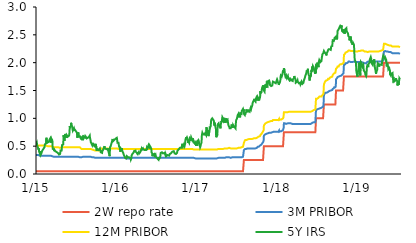
| Category | 2W repo rate | 3M PRIBOR | 12M PRIBOR | 5Y IRS |
|---|---|---|---|---|
| 2015-01-02 | 0.05 | 0.34 | 0.51 | 0.55 |
| 2015-01-05 | 0.05 | 0.34 | 0.51 | 0.57 |
| 2015-01-06 | 0.05 | 0.34 | 0.51 | 0.54 |
| 2015-01-07 | 0.05 | 0.34 | 0.51 | 0.51 |
| 2015-01-08 | 0.05 | 0.34 | 0.51 | 0.52 |
| 2015-01-09 | 0.05 | 0.34 | 0.51 | 0.49 |
| 2015-01-12 | 0.05 | 0.34 | 0.51 | 0.48 |
| 2015-01-13 | 0.05 | 0.33 | 0.51 | 0.44 |
| 2015-01-14 | 0.05 | 0.33 | 0.51 | 0.46 |
| 2015-01-15 | 0.05 | 0.33 | 0.51 | 0.45 |
| 2015-01-16 | 0.05 | 0.33 | 0.51 | 0.4 |
| 2015-01-19 | 0.05 | 0.33 | 0.51 | 0.4 |
| 2015-01-20 | 0.05 | 0.33 | 0.51 | 0.36 |
| 2015-01-21 | 0.05 | 0.33 | 0.51 | 0.38 |
| 2015-01-22 | 0.05 | 0.33 | 0.51 | 0.41 |
| 2015-01-23 | 0.05 | 0.33 | 0.51 | 0.35 |
| 2015-01-26 | 0.05 | 0.33 | 0.51 | 0.36 |
| 2015-01-27 | 0.05 | 0.33 | 0.51 | 0.38 |
| 2015-01-28 | 0.05 | 0.33 | 0.51 | 0.4 |
| 2015-01-29 | 0.05 | 0.33 | 0.51 | 0.41 |
| 2015-01-30 | 0.05 | 0.33 | 0.51 | 0.42 |
| 2015-02-02 | 0.05 | 0.33 | 0.51 | 0.41 |
| 2015-02-03 | 0.05 | 0.33 | 0.51 | 0.41 |
| 2015-02-04 | 0.05 | 0.33 | 0.51 | 0.45 |
| 2015-02-05 | 0.05 | 0.33 | 0.51 | 0.46 |
| 2015-02-06 | 0.05 | 0.33 | 0.51 | 0.46 |
| 2015-02-09 | 0.05 | 0.33 | 0.51 | 0.48 |
| 2015-02-10 | 0.05 | 0.33 | 0.51 | 0.49 |
| 2015-02-11 | 0.05 | 0.33 | 0.51 | 0.53 |
| 2015-02-12 | 0.05 | 0.33 | 0.51 | 0.54 |
| 2015-02-13 | 0.05 | 0.33 | 0.51 | 0.53 |
| 2015-02-16 | 0.05 | 0.33 | 0.51 | 0.55 |
| 2015-02-17 | 0.05 | 0.33 | 0.51 | 0.58 |
| 2015-02-18 | 0.05 | 0.33 | 0.51 | 0.65 |
| 2015-02-19 | 0.05 | 0.33 | 0.51 | 0.55 |
| 2015-02-20 | 0.05 | 0.33 | 0.5 | 0.6 |
| 2015-02-23 | 0.05 | 0.33 | 0.5 | 0.61 |
| 2015-02-24 | 0.05 | 0.33 | 0.5 | 0.61 |
| 2015-02-25 | 0.05 | 0.33 | 0.5 | 0.57 |
| 2015-02-26 | 0.05 | 0.33 | 0.5 | 0.57 |
| 2015-02-27 | 0.05 | 0.33 | 0.5 | 0.57 |
| 2015-03-02 | 0.05 | 0.33 | 0.5 | 0.58 |
| 2015-03-03 | 0.05 | 0.33 | 0.5 | 0.57 |
| 2015-03-04 | 0.05 | 0.33 | 0.5 | 0.62 |
| 2015-03-05 | 0.05 | 0.33 | 0.5 | 0.62 |
| 2015-03-06 | 0.05 | 0.33 | 0.5 | 0.62 |
| 2015-03-09 | 0.05 | 0.33 | 0.5 | 0.65 |
| 2015-03-10 | 0.05 | 0.33 | 0.5 | 0.62 |
| 2015-03-11 | 0.05 | 0.33 | 0.5 | 0.62 |
| 2015-03-12 | 0.05 | 0.33 | 0.5 | 0.56 |
| 2015-03-13 | 0.05 | 0.33 | 0.5 | 0.63 |
| 2015-03-16 | 0.05 | 0.32 | 0.49 | 0.61 |
| 2015-03-17 | 0.05 | 0.32 | 0.49 | 0.59 |
| 2015-03-18 | 0.05 | 0.31 | 0.49 | 0.5 |
| 2015-03-19 | 0.05 | 0.31 | 0.48 | 0.45 |
| 2015-03-20 | 0.05 | 0.31 | 0.48 | 0.44 |
| 2015-03-23 | 0.05 | 0.31 | 0.48 | 0.46 |
| 2015-03-24 | 0.05 | 0.31 | 0.48 | 0.44 |
| 2015-03-25 | 0.05 | 0.31 | 0.48 | 0.43 |
| 2015-03-26 | 0.05 | 0.31 | 0.48 | 0.41 |
| 2015-03-27 | 0.05 | 0.31 | 0.48 | 0.43 |
| 2015-03-30 | 0.05 | 0.31 | 0.48 | 0.41 |
| 2015-03-31 | 0.05 | 0.31 | 0.48 | 0.41 |
| 2015-04-01 | 0.05 | 0.31 | 0.48 | 0.41 |
| 2015-04-02 | 0.05 | 0.31 | 0.48 | 0.4 |
| 2015-04-03 | 0.05 | 0.31 | 0.48 | 0.4 |
| 2015-04-07 | 0.05 | 0.31 | 0.48 | 0.39 |
| 2015-04-08 | 0.05 | 0.31 | 0.48 | 0.39 |
| 2015-04-09 | 0.05 | 0.31 | 0.48 | 0.38 |
| 2015-04-10 | 0.05 | 0.31 | 0.48 | 0.38 |
| 2015-04-13 | 0.05 | 0.31 | 0.48 | 0.37 |
| 2015-04-14 | 0.05 | 0.31 | 0.47 | 0.37 |
| 2015-04-15 | 0.05 | 0.31 | 0.48 | 0.37 |
| 2015-04-16 | 0.05 | 0.31 | 0.47 | 0.35 |
| 2015-04-17 | 0.05 | 0.31 | 0.47 | 0.36 |
| 2015-04-20 | 0.05 | 0.31 | 0.47 | 0.35 |
| 2015-04-21 | 0.05 | 0.31 | 0.47 | 0.36 |
| 2015-04-22 | 0.05 | 0.31 | 0.47 | 0.38 |
| 2015-04-23 | 0.05 | 0.31 | 0.48 | 0.42 |
| 2015-04-24 | 0.05 | 0.31 | 0.47 | 0.42 |
| 2015-04-27 | 0.05 | 0.31 | 0.48 | 0.41 |
| 2015-04-28 | 0.05 | 0.31 | 0.48 | 0.42 |
| 2015-04-29 | 0.05 | 0.31 | 0.48 | 0.47 |
| 2015-04-30 | 0.05 | 0.31 | 0.48 | 0.52 |
| 2015-05-04 | 0.05 | 0.31 | 0.48 | 0.53 |
| 2015-05-05 | 0.05 | 0.31 | 0.48 | 0.53 |
| 2015-05-06 | 0.05 | 0.31 | 0.48 | 0.59 |
| 2015-05-07 | 0.05 | 0.31 | 0.48 | 0.7 |
| 2015-05-11 | 0.05 | 0.31 | 0.48 | 0.6 |
| 2015-05-12 | 0.05 | 0.31 | 0.48 | 0.69 |
| 2015-05-13 | 0.05 | 0.31 | 0.48 | 0.66 |
| 2015-05-14 | 0.05 | 0.31 | 0.48 | 0.72 |
| 2015-05-15 | 0.05 | 0.31 | 0.48 | 0.7 |
| 2015-05-18 | 0.05 | 0.31 | 0.48 | 0.7 |
| 2015-05-19 | 0.05 | 0.31 | 0.48 | 0.65 |
| 2015-05-20 | 0.05 | 0.31 | 0.48 | 0.68 |
| 2015-05-21 | 0.05 | 0.31 | 0.48 | 0.7 |
| 2015-05-22 | 0.05 | 0.31 | 0.48 | 0.7 |
| 2015-05-25 | 0.05 | 0.31 | 0.48 | 0.7 |
| 2015-05-26 | 0.05 | 0.31 | 0.48 | 0.67 |
| 2015-05-27 | 0.05 | 0.31 | 0.48 | 0.67 |
| 2015-05-28 | 0.05 | 0.31 | 0.48 | 0.66 |
| 2015-05-29 | 0.05 | 0.31 | 0.48 | 0.68 |
| 2015-06-01 | 0.05 | 0.31 | 0.48 | 0.69 |
| 2015-06-02 | 0.05 | 0.31 | 0.48 | 0.72 |
| 2015-06-03 | 0.05 | 0.31 | 0.48 | 0.75 |
| 2015-06-04 | 0.05 | 0.31 | 0.48 | 0.86 |
| 2015-06-05 | 0.05 | 0.31 | 0.48 | 0.84 |
| 2015-06-08 | 0.05 | 0.31 | 0.48 | 0.84 |
| 2015-06-09 | 0.05 | 0.31 | 0.48 | 0.86 |
| 2015-06-10 | 0.05 | 0.31 | 0.48 | 0.92 |
| 2015-06-11 | 0.05 | 0.31 | 0.48 | 0.92 |
| 2015-06-12 | 0.05 | 0.31 | 0.48 | 0.89 |
| 2015-06-15 | 0.05 | 0.31 | 0.48 | 0.85 |
| 2015-06-16 | 0.05 | 0.31 | 0.48 | 0.82 |
| 2015-06-17 | 0.05 | 0.31 | 0.48 | 0.82 |
| 2015-06-18 | 0.05 | 0.31 | 0.48 | 0.78 |
| 2015-06-19 | 0.05 | 0.31 | 0.48 | 0.77 |
| 2015-06-22 | 0.05 | 0.31 | 0.48 | 0.79 |
| 2015-06-23 | 0.05 | 0.31 | 0.48 | 0.82 |
| 2015-06-24 | 0.05 | 0.31 | 0.48 | 0.8 |
| 2015-06-25 | 0.05 | 0.31 | 0.48 | 0.78 |
| 2015-06-26 | 0.05 | 0.31 | 0.48 | 0.8 |
| 2015-06-29 | 0.05 | 0.31 | 0.48 | 0.8 |
| 2015-06-30 | 0.05 | 0.31 | 0.48 | 0.78 |
| 2015-07-01 | 0.05 | 0.31 | 0.48 | 0.79 |
| 2015-07-02 | 0.05 | 0.31 | 0.48 | 0.79 |
| 2015-07-03 | 0.05 | 0.31 | 0.48 | 0.78 |
| 2015-07-07 | 0.05 | 0.31 | 0.48 | 0.74 |
| 2015-07-08 | 0.05 | 0.31 | 0.47 | 0.68 |
| 2015-07-09 | 0.05 | 0.31 | 0.47 | 0.65 |
| 2015-07-10 | 0.05 | 0.31 | 0.47 | 0.7 |
| 2015-07-13 | 0.05 | 0.31 | 0.48 | 0.75 |
| 2015-07-14 | 0.05 | 0.31 | 0.48 | 0.68 |
| 2015-07-15 | 0.05 | 0.3 | 0.48 | 0.69 |
| 2015-07-16 | 0.05 | 0.3 | 0.48 | 0.67 |
| 2015-07-17 | 0.05 | 0.3 | 0.48 | 0.69 |
| 2015-07-20 | 0.05 | 0.3 | 0.48 | 0.68 |
| 2015-07-21 | 0.05 | 0.3 | 0.48 | 0.66 |
| 2015-07-22 | 0.05 | 0.31 | 0.48 | 0.67 |
| 2015-07-23 | 0.05 | 0.31 | 0.48 | 0.67 |
| 2015-07-24 | 0.05 | 0.3 | 0.48 | 0.64 |
| 2015-07-27 | 0.05 | 0.3 | 0.45 | 0.63 |
| 2015-07-28 | 0.05 | 0.3 | 0.45 | 0.63 |
| 2015-07-29 | 0.05 | 0.3 | 0.45 | 0.66 |
| 2015-07-30 | 0.05 | 0.3 | 0.45 | 0.62 |
| 2015-07-31 | 0.05 | 0.31 | 0.45 | 0.62 |
| 2015-08-03 | 0.05 | 0.31 | 0.45 | 0.62 |
| 2015-08-04 | 0.05 | 0.31 | 0.45 | 0.62 |
| 2015-08-05 | 0.05 | 0.31 | 0.45 | 0.64 |
| 2015-08-06 | 0.05 | 0.31 | 0.45 | 0.68 |
| 2015-08-07 | 0.05 | 0.31 | 0.45 | 0.68 |
| 2015-08-10 | 0.05 | 0.31 | 0.45 | 0.68 |
| 2015-08-11 | 0.05 | 0.31 | 0.45 | 0.67 |
| 2015-08-12 | 0.05 | 0.31 | 0.45 | 0.64 |
| 2015-08-13 | 0.05 | 0.31 | 0.45 | 0.65 |
| 2015-08-14 | 0.05 | 0.31 | 0.45 | 0.68 |
| 2015-08-17 | 0.05 | 0.31 | 0.45 | 0.67 |
| 2015-08-18 | 0.05 | 0.31 | 0.45 | 0.66 |
| 2015-08-19 | 0.05 | 0.31 | 0.45 | 0.65 |
| 2015-08-20 | 0.05 | 0.31 | 0.45 | 0.64 |
| 2015-08-21 | 0.05 | 0.31 | 0.45 | 0.64 |
| 2015-08-24 | 0.05 | 0.31 | 0.45 | 0.63 |
| 2015-08-25 | 0.05 | 0.31 | 0.45 | 0.65 |
| 2015-08-26 | 0.05 | 0.31 | 0.45 | 0.65 |
| 2015-08-27 | 0.05 | 0.31 | 0.45 | 0.66 |
| 2015-08-28 | 0.05 | 0.31 | 0.45 | 0.66 |
| 2015-08-31 | 0.05 | 0.31 | 0.45 | 0.67 |
| 2015-09-01 | 0.05 | 0.31 | 0.45 | 0.68 |
| 2015-09-02 | 0.05 | 0.31 | 0.45 | 0.68 |
| 2015-09-03 | 0.05 | 0.31 | 0.45 | 0.69 |
| 2015-09-04 | 0.05 | 0.31 | 0.45 | 0.65 |
| 2015-09-07 | 0.05 | 0.31 | 0.45 | 0.6 |
| 2015-09-08 | 0.05 | 0.3 | 0.44 | 0.57 |
| 2015-09-09 | 0.05 | 0.3 | 0.44 | 0.57 |
| 2015-09-10 | 0.05 | 0.3 | 0.44 | 0.57 |
| 2015-09-11 | 0.05 | 0.3 | 0.44 | 0.56 |
| 2015-09-14 | 0.05 | 0.3 | 0.44 | 0.52 |
| 2015-09-15 | 0.05 | 0.3 | 0.44 | 0.54 |
| 2015-09-16 | 0.05 | 0.31 | 0.44 | 0.56 |
| 2015-09-17 | 0.05 | 0.31 | 0.44 | 0.57 |
| 2015-09-18 | 0.05 | 0.31 | 0.44 | 0.53 |
| 2015-09-21 | 0.05 | 0.3 | 0.43 | 0.53 |
| 2015-09-22 | 0.05 | 0.3 | 0.43 | 0.51 |
| 2015-09-23 | 0.05 | 0.3 | 0.43 | 0.53 |
| 2015-09-24 | 0.05 | 0.3 | 0.43 | 0.53 |
| 2015-09-25 | 0.05 | 0.29 | 0.42 | 0.53 |
| 2015-09-29 | 0.05 | 0.29 | 0.42 | 0.53 |
| 2015-09-30 | 0.05 | 0.29 | 0.42 | 0.48 |
| 2015-10-01 | 0.05 | 0.29 | 0.42 | 0.53 |
| 2015-10-02 | 0.05 | 0.29 | 0.42 | 0.53 |
| 2015-10-05 | 0.05 | 0.29 | 0.42 | 0.42 |
| 2015-10-06 | 0.05 | 0.29 | 0.42 | 0.46 |
| 2015-10-07 | 0.05 | 0.29 | 0.42 | 0.46 |
| 2015-10-08 | 0.05 | 0.29 | 0.42 | 0.44 |
| 2015-10-09 | 0.05 | 0.29 | 0.42 | 0.44 |
| 2015-10-12 | 0.05 | 0.29 | 0.42 | 0.45 |
| 2015-10-13 | 0.05 | 0.29 | 0.42 | 0.43 |
| 2015-10-14 | 0.05 | 0.29 | 0.42 | 0.43 |
| 2015-10-15 | 0.05 | 0.29 | 0.42 | 0.43 |
| 2015-10-16 | 0.05 | 0.29 | 0.42 | 0.44 |
| 2015-10-19 | 0.05 | 0.29 | 0.42 | 0.46 |
| 2015-10-20 | 0.05 | 0.29 | 0.42 | 0.44 |
| 2015-10-21 | 0.05 | 0.29 | 0.42 | 0.45 |
| 2015-10-22 | 0.05 | 0.29 | 0.42 | 0.42 |
| 2015-10-23 | 0.05 | 0.29 | 0.42 | 0.39 |
| 2015-10-26 | 0.05 | 0.29 | 0.46 | 0.4 |
| 2015-10-27 | 0.05 | 0.29 | 0.45 | 0.38 |
| 2015-10-29 | 0.05 | 0.29 | 0.45 | 0.38 |
| 2015-10-30 | 0.05 | 0.29 | 0.45 | 0.41 |
| 2015-11-02 | 0.05 | 0.29 | 0.45 | 0.43 |
| 2015-11-03 | 0.05 | 0.29 | 0.46 | 0.44 |
| 2015-11-04 | 0.05 | 0.29 | 0.46 | 0.44 |
| 2015-11-05 | 0.05 | 0.29 | 0.46 | 0.44 |
| 2015-11-06 | 0.05 | 0.29 | 0.45 | 0.44 |
| 2015-11-09 | 0.05 | 0.29 | 0.46 | 0.5 |
| 2015-11-10 | 0.05 | 0.29 | 0.46 | 0.46 |
| 2015-11-11 | 0.05 | 0.29 | 0.46 | 0.46 |
| 2015-11-12 | 0.05 | 0.29 | 0.46 | 0.45 |
| 2015-11-13 | 0.05 | 0.29 | 0.46 | 0.46 |
| 2015-11-16 | 0.05 | 0.29 | 0.46 | 0.45 |
| 2015-11-18 | 0.05 | 0.29 | 0.46 | 0.45 |
| 2015-11-19 | 0.05 | 0.29 | 0.46 | 0.44 |
| 2015-11-20 | 0.05 | 0.29 | 0.46 | 0.44 |
| 2015-11-23 | 0.05 | 0.29 | 0.46 | 0.44 |
| 2015-11-24 | 0.05 | 0.29 | 0.46 | 0.44 |
| 2015-11-25 | 0.05 | 0.29 | 0.46 | 0.46 |
| 2015-11-26 | 0.05 | 0.29 | 0.46 | 0.42 |
| 2015-11-27 | 0.05 | 0.29 | 0.45 | 0.42 |
| 2015-11-30 | 0.05 | 0.29 | 0.45 | 0.36 |
| 2015-12-01 | 0.05 | 0.28 | 0.45 | 0.37 |
| 2015-12-02 | 0.05 | 0.28 | 0.45 | 0.32 |
| 2015-12-03 | 0.05 | 0.28 | 0.45 | 0.34 |
| 2015-12-04 | 0.05 | 0.29 | 0.46 | 0.48 |
| 2015-12-07 | 0.05 | 0.29 | 0.46 | 0.5 |
| 2015-12-08 | 0.05 | 0.29 | 0.46 | 0.49 |
| 2015-12-09 | 0.05 | 0.29 | 0.46 | 0.51 |
| 2015-12-10 | 0.05 | 0.29 | 0.46 | 0.54 |
| 2015-12-11 | 0.05 | 0.29 | 0.46 | 0.53 |
| 2015-12-14 | 0.05 | 0.29 | 0.46 | 0.55 |
| 2015-12-15 | 0.05 | 0.29 | 0.46 | 0.61 |
| 2015-12-16 | 0.05 | 0.29 | 0.46 | 0.63 |
| 2015-12-17 | 0.05 | 0.29 | 0.46 | 0.62 |
| 2015-12-18 | 0.05 | 0.29 | 0.46 | 0.59 |
| 2015-12-21 | 0.05 | 0.29 | 0.46 | 0.59 |
| 2015-12-22 | 0.05 | 0.29 | 0.46 | 0.59 |
| 2015-12-23 | 0.05 | 0.29 | 0.46 | 0.61 |
| 2015-12-28 | 0.05 | 0.29 | 0.46 | 0.63 |
| 2015-12-29 | 0.05 | 0.29 | 0.46 | 0.63 |
| 2015-12-30 | 0.05 | 0.29 | 0.46 | 0.64 |
| 2015-12-31 | 0.05 | 0.29 | 0.46 | 0.64 |
| 2016-01-04 | 0.05 | 0.29 | 0.46 | 0.65 |
| 2016-01-05 | 0.05 | 0.29 | 0.46 | 0.63 |
| 2016-01-06 | 0.05 | 0.29 | 0.46 | 0.62 |
| 2016-01-07 | 0.05 | 0.29 | 0.46 | 0.56 |
| 2016-01-08 | 0.05 | 0.29 | 0.46 | 0.57 |
| 2016-01-11 | 0.05 | 0.29 | 0.45 | 0.56 |
| 2016-01-12 | 0.05 | 0.29 | 0.45 | 0.56 |
| 2016-01-13 | 0.05 | 0.29 | 0.45 | 0.56 |
| 2016-01-14 | 0.05 | 0.29 | 0.45 | 0.5 |
| 2016-01-15 | 0.05 | 0.29 | 0.45 | 0.49 |
| 2016-01-18 | 0.05 | 0.29 | 0.45 | 0.46 |
| 2016-01-19 | 0.05 | 0.29 | 0.45 | 0.46 |
| 2016-01-20 | 0.05 | 0.29 | 0.45 | 0.4 |
| 2016-01-21 | 0.05 | 0.29 | 0.45 | 0.43 |
| 2016-01-22 | 0.05 | 0.29 | 0.45 | 0.46 |
| 2016-01-25 | 0.05 | 0.29 | 0.45 | 0.45 |
| 2016-01-26 | 0.05 | 0.29 | 0.45 | 0.44 |
| 2016-01-27 | 0.05 | 0.29 | 0.45 | 0.46 |
| 2016-01-28 | 0.05 | 0.29 | 0.45 | 0.44 |
| 2016-01-29 | 0.05 | 0.29 | 0.45 | 0.41 |
| 2016-02-01 | 0.05 | 0.29 | 0.45 | 0.4 |
| 2016-02-02 | 0.05 | 0.29 | 0.45 | 0.38 |
| 2016-02-03 | 0.05 | 0.29 | 0.45 | 0.37 |
| 2016-02-04 | 0.05 | 0.29 | 0.45 | 0.37 |
| 2016-02-05 | 0.05 | 0.29 | 0.45 | 0.34 |
| 2016-02-08 | 0.05 | 0.29 | 0.45 | 0.32 |
| 2016-02-09 | 0.05 | 0.28 | 0.45 | 0.31 |
| 2016-02-10 | 0.05 | 0.28 | 0.45 | 0.31 |
| 2016-02-11 | 0.05 | 0.28 | 0.45 | 0.29 |
| 2016-02-12 | 0.05 | 0.28 | 0.45 | 0.28 |
| 2016-02-15 | 0.05 | 0.28 | 0.45 | 0.28 |
| 2016-02-16 | 0.05 | 0.28 | 0.45 | 0.28 |
| 2016-02-17 | 0.05 | 0.28 | 0.45 | 0.28 |
| 2016-02-18 | 0.05 | 0.28 | 0.45 | 0.3 |
| 2016-02-19 | 0.05 | 0.28 | 0.45 | 0.32 |
| 2016-02-22 | 0.05 | 0.28 | 0.45 | 0.32 |
| 2016-02-23 | 0.05 | 0.28 | 0.45 | 0.32 |
| 2016-02-24 | 0.05 | 0.28 | 0.45 | 0.3 |
| 2016-02-25 | 0.05 | 0.28 | 0.45 | 0.3 |
| 2016-02-26 | 0.05 | 0.28 | 0.45 | 0.31 |
| 2016-02-29 | 0.05 | 0.28 | 0.45 | 0.3 |
| 2016-03-01 | 0.05 | 0.28 | 0.45 | 0.29 |
| 2016-03-02 | 0.05 | 0.28 | 0.45 | 0.31 |
| 2016-03-03 | 0.05 | 0.28 | 0.45 | 0.3 |
| 2016-03-04 | 0.05 | 0.28 | 0.45 | 0.29 |
| 2016-03-07 | 0.05 | 0.28 | 0.45 | 0.28 |
| 2016-03-08 | 0.05 | 0.28 | 0.45 | 0.26 |
| 2016-03-09 | 0.05 | 0.28 | 0.45 | 0.26 |
| 2016-03-10 | 0.05 | 0.28 | 0.45 | 0.28 |
| 2016-03-11 | 0.05 | 0.29 | 0.45 | 0.33 |
| 2016-03-14 | 0.05 | 0.29 | 0.45 | 0.34 |
| 2016-03-15 | 0.05 | 0.29 | 0.45 | 0.36 |
| 2016-03-16 | 0.05 | 0.29 | 0.45 | 0.37 |
| 2016-03-17 | 0.05 | 0.29 | 0.45 | 0.37 |
| 2016-03-18 | 0.05 | 0.29 | 0.45 | 0.37 |
| 2016-03-21 | 0.05 | 0.29 | 0.45 | 0.39 |
| 2016-03-22 | 0.05 | 0.29 | 0.45 | 0.41 |
| 2016-03-23 | 0.05 | 0.29 | 0.45 | 0.41 |
| 2016-03-24 | 0.05 | 0.29 | 0.45 | 0.4 |
| 2016-03-29 | 0.05 | 0.29 | 0.45 | 0.42 |
| 2016-03-30 | 0.05 | 0.29 | 0.45 | 0.4 |
| 2016-03-31 | 0.05 | 0.29 | 0.45 | 0.4 |
| 2016-04-01 | 0.05 | 0.29 | 0.45 | 0.4 |
| 2016-04-04 | 0.05 | 0.29 | 0.45 | 0.38 |
| 2016-04-05 | 0.05 | 0.29 | 0.45 | 0.37 |
| 2016-04-06 | 0.05 | 0.29 | 0.45 | 0.38 |
| 2016-04-07 | 0.05 | 0.29 | 0.45 | 0.36 |
| 2016-04-08 | 0.05 | 0.29 | 0.45 | 0.36 |
| 2016-04-11 | 0.05 | 0.29 | 0.45 | 0.35 |
| 2016-04-12 | 0.05 | 0.29 | 0.45 | 0.39 |
| 2016-04-13 | 0.05 | 0.29 | 0.45 | 0.37 |
| 2016-04-14 | 0.05 | 0.29 | 0.45 | 0.39 |
| 2016-04-15 | 0.05 | 0.29 | 0.45 | 0.37 |
| 2016-04-18 | 0.05 | 0.29 | 0.45 | 0.37 |
| 2016-04-19 | 0.05 | 0.29 | 0.45 | 0.39 |
| 2016-04-20 | 0.05 | 0.29 | 0.45 | 0.38 |
| 2016-04-21 | 0.05 | 0.29 | 0.45 | 0.41 |
| 2016-04-22 | 0.05 | 0.29 | 0.45 | 0.41 |
| 2016-04-25 | 0.05 | 0.29 | 0.45 | 0.42 |
| 2016-04-26 | 0.05 | 0.29 | 0.45 | 0.46 |
| 2016-04-27 | 0.05 | 0.29 | 0.45 | 0.46 |
| 2016-04-28 | 0.05 | 0.29 | 0.45 | 0.44 |
| 2016-04-29 | 0.05 | 0.29 | 0.45 | 0.45 |
| 2016-05-02 | 0.05 | 0.29 | 0.45 | 0.46 |
| 2016-05-03 | 0.05 | 0.29 | 0.45 | 0.46 |
| 2016-05-04 | 0.05 | 0.29 | 0.45 | 0.44 |
| 2016-05-05 | 0.05 | 0.29 | 0.45 | 0.45 |
| 2016-05-06 | 0.05 | 0.29 | 0.45 | 0.44 |
| 2016-05-09 | 0.05 | 0.29 | 0.45 | 0.43 |
| 2016-05-10 | 0.05 | 0.29 | 0.45 | 0.44 |
| 2016-05-11 | 0.05 | 0.29 | 0.45 | 0.43 |
| 2016-05-12 | 0.05 | 0.29 | 0.45 | 0.42 |
| 2016-05-13 | 0.05 | 0.29 | 0.45 | 0.43 |
| 2016-05-16 | 0.05 | 0.29 | 0.45 | 0.43 |
| 2016-05-17 | 0.05 | 0.29 | 0.45 | 0.44 |
| 2016-05-18 | 0.05 | 0.29 | 0.45 | 0.44 |
| 2016-05-19 | 0.05 | 0.29 | 0.45 | 0.46 |
| 2016-05-20 | 0.05 | 0.29 | 0.45 | 0.48 |
| 2016-05-23 | 0.05 | 0.29 | 0.45 | 0.46 |
| 2016-05-24 | 0.05 | 0.29 | 0.45 | 0.46 |
| 2016-05-25 | 0.05 | 0.29 | 0.45 | 0.48 |
| 2016-05-26 | 0.05 | 0.29 | 0.45 | 0.48 |
| 2016-05-27 | 0.05 | 0.29 | 0.45 | 0.51 |
| 2016-05-30 | 0.05 | 0.29 | 0.45 | 0.49 |
| 2016-05-31 | 0.05 | 0.29 | 0.45 | 0.52 |
| 2016-06-01 | 0.05 | 0.29 | 0.45 | 0.51 |
| 2016-06-02 | 0.05 | 0.29 | 0.45 | 0.51 |
| 2016-06-03 | 0.05 | 0.29 | 0.45 | 0.51 |
| 2016-06-06 | 0.05 | 0.29 | 0.45 | 0.48 |
| 2016-06-07 | 0.05 | 0.29 | 0.45 | 0.49 |
| 2016-06-08 | 0.05 | 0.29 | 0.45 | 0.47 |
| 2016-06-09 | 0.05 | 0.29 | 0.45 | 0.45 |
| 2016-06-10 | 0.05 | 0.29 | 0.45 | 0.39 |
| 2016-06-13 | 0.05 | 0.29 | 0.45 | 0.37 |
| 2016-06-14 | 0.05 | 0.29 | 0.45 | 0.32 |
| 2016-06-15 | 0.05 | 0.29 | 0.45 | 0.32 |
| 2016-06-16 | 0.05 | 0.29 | 0.45 | 0.32 |
| 2016-06-17 | 0.05 | 0.29 | 0.45 | 0.35 |
| 2016-06-20 | 0.05 | 0.29 | 0.45 | 0.35 |
| 2016-06-21 | 0.05 | 0.29 | 0.45 | 0.36 |
| 2016-06-22 | 0.05 | 0.29 | 0.45 | 0.36 |
| 2016-06-23 | 0.05 | 0.29 | 0.45 | 0.36 |
| 2016-06-24 | 0.05 | 0.29 | 0.45 | 0.33 |
| 2016-06-27 | 0.05 | 0.29 | 0.45 | 0.32 |
| 2016-06-28 | 0.05 | 0.29 | 0.45 | 0.35 |
| 2016-06-29 | 0.05 | 0.29 | 0.45 | 0.33 |
| 2016-06-30 | 0.05 | 0.29 | 0.45 | 0.31 |
| 2016-07-01 | 0.05 | 0.29 | 0.45 | 0.31 |
| 2016-07-04 | 0.05 | 0.29 | 0.45 | 0.29 |
| 2016-07-07 | 0.05 | 0.29 | 0.45 | 0.28 |
| 2016-07-08 | 0.05 | 0.29 | 0.45 | 0.28 |
| 2016-07-11 | 0.05 | 0.29 | 0.45 | 0.26 |
| 2016-07-12 | 0.05 | 0.29 | 0.45 | 0.3 |
| 2016-07-13 | 0.05 | 0.29 | 0.45 | 0.29 |
| 2016-07-14 | 0.05 | 0.29 | 0.45 | 0.27 |
| 2016-07-15 | 0.05 | 0.29 | 0.45 | 0.28 |
| 2016-07-18 | 0.05 | 0.29 | 0.45 | 0.29 |
| 2016-07-19 | 0.05 | 0.29 | 0.45 | 0.28 |
| 2016-07-20 | 0.05 | 0.29 | 0.45 | 0.32 |
| 2016-07-21 | 0.05 | 0.29 | 0.45 | 0.36 |
| 2016-07-22 | 0.05 | 0.29 | 0.45 | 0.38 |
| 2016-07-25 | 0.05 | 0.29 | 0.45 | 0.38 |
| 2016-07-26 | 0.05 | 0.29 | 0.45 | 0.38 |
| 2016-07-27 | 0.05 | 0.29 | 0.45 | 0.39 |
| 2016-07-28 | 0.05 | 0.29 | 0.45 | 0.38 |
| 2016-07-29 | 0.05 | 0.29 | 0.45 | 0.38 |
| 2016-08-01 | 0.05 | 0.29 | 0.45 | 0.37 |
| 2016-08-02 | 0.05 | 0.29 | 0.45 | 0.37 |
| 2016-08-03 | 0.05 | 0.29 | 0.45 | 0.37 |
| 2016-08-04 | 0.05 | 0.29 | 0.45 | 0.38 |
| 2016-08-05 | 0.05 | 0.29 | 0.45 | 0.38 |
| 2016-08-08 | 0.05 | 0.29 | 0.45 | 0.38 |
| 2016-08-09 | 0.05 | 0.29 | 0.45 | 0.37 |
| 2016-08-10 | 0.05 | 0.29 | 0.45 | 0.37 |
| 2016-08-11 | 0.05 | 0.29 | 0.45 | 0.35 |
| 2016-08-12 | 0.05 | 0.29 | 0.45 | 0.37 |
| 2016-08-15 | 0.05 | 0.29 | 0.45 | 0.34 |
| 2016-08-16 | 0.05 | 0.29 | 0.45 | 0.32 |
| 2016-08-17 | 0.05 | 0.29 | 0.45 | 0.33 |
| 2016-08-18 | 0.05 | 0.29 | 0.45 | 0.33 |
| 2016-08-19 | 0.05 | 0.29 | 0.45 | 0.33 |
| 2016-08-22 | 0.05 | 0.29 | 0.45 | 0.34 |
| 2016-08-23 | 0.05 | 0.29 | 0.45 | 0.33 |
| 2016-08-24 | 0.05 | 0.29 | 0.45 | 0.33 |
| 2016-08-25 | 0.05 | 0.29 | 0.45 | 0.33 |
| 2016-08-26 | 0.05 | 0.29 | 0.45 | 0.33 |
| 2016-08-29 | 0.05 | 0.29 | 0.45 | 0.33 |
| 2016-08-30 | 0.05 | 0.29 | 0.45 | 0.33 |
| 2016-08-31 | 0.05 | 0.29 | 0.45 | 0.34 |
| 2016-09-01 | 0.05 | 0.29 | 0.45 | 0.36 |
| 2016-09-02 | 0.05 | 0.29 | 0.45 | 0.36 |
| 2016-09-05 | 0.05 | 0.29 | 0.45 | 0.37 |
| 2016-09-06 | 0.05 | 0.29 | 0.45 | 0.37 |
| 2016-09-07 | 0.05 | 0.29 | 0.45 | 0.36 |
| 2016-09-08 | 0.05 | 0.29 | 0.45 | 0.36 |
| 2016-09-09 | 0.05 | 0.29 | 0.45 | 0.38 |
| 2016-09-12 | 0.05 | 0.29 | 0.45 | 0.4 |
| 2016-09-13 | 0.05 | 0.29 | 0.45 | 0.4 |
| 2016-09-14 | 0.05 | 0.29 | 0.45 | 0.4 |
| 2016-09-15 | 0.05 | 0.29 | 0.45 | 0.41 |
| 2016-09-16 | 0.05 | 0.29 | 0.45 | 0.41 |
| 2016-09-19 | 0.05 | 0.29 | 0.45 | 0.41 |
| 2016-09-20 | 0.05 | 0.29 | 0.45 | 0.41 |
| 2016-09-21 | 0.05 | 0.29 | 0.45 | 0.39 |
| 2016-09-22 | 0.05 | 0.29 | 0.45 | 0.38 |
| 2016-09-23 | 0.05 | 0.29 | 0.45 | 0.37 |
| 2016-09-26 | 0.05 | 0.29 | 0.45 | 0.36 |
| 2016-09-27 | 0.05 | 0.29 | 0.45 | 0.36 |
| 2016-09-29 | 0.05 | 0.29 | 0.45 | 0.36 |
| 2016-09-30 | 0.05 | 0.29 | 0.45 | 0.36 |
| 2016-10-03 | 0.05 | 0.29 | 0.45 | 0.37 |
| 2016-10-04 | 0.05 | 0.29 | 0.45 | 0.38 |
| 2016-10-05 | 0.05 | 0.29 | 0.45 | 0.39 |
| 2016-10-06 | 0.05 | 0.29 | 0.45 | 0.42 |
| 2016-10-07 | 0.05 | 0.29 | 0.45 | 0.42 |
| 2016-10-10 | 0.05 | 0.29 | 0.45 | 0.43 |
| 2016-10-11 | 0.05 | 0.29 | 0.45 | 0.44 |
| 2016-10-12 | 0.05 | 0.29 | 0.45 | 0.44 |
| 2016-10-13 | 0.05 | 0.29 | 0.45 | 0.45 |
| 2016-10-14 | 0.05 | 0.29 | 0.45 | 0.45 |
| 2016-10-17 | 0.05 | 0.29 | 0.45 | 0.47 |
| 2016-10-18 | 0.05 | 0.29 | 0.45 | 0.47 |
| 2016-10-19 | 0.05 | 0.29 | 0.45 | 0.47 |
| 2016-10-20 | 0.05 | 0.29 | 0.45 | 0.48 |
| 2016-10-21 | 0.05 | 0.29 | 0.45 | 0.48 |
| 2016-10-24 | 0.05 | 0.29 | 0.45 | 0.48 |
| 2016-10-25 | 0.05 | 0.29 | 0.45 | 0.46 |
| 2016-10-26 | 0.05 | 0.29 | 0.45 | 0.48 |
| 2016-10-27 | 0.05 | 0.29 | 0.45 | 0.53 |
| 2016-10-31 | 0.05 | 0.29 | 0.45 | 0.54 |
| 2016-11-01 | 0.05 | 0.29 | 0.45 | 0.53 |
| 2016-11-02 | 0.05 | 0.29 | 0.45 | 0.51 |
| 2016-11-03 | 0.05 | 0.29 | 0.45 | 0.52 |
| 2016-11-04 | 0.05 | 0.29 | 0.45 | 0.53 |
| 2016-11-07 | 0.05 | 0.29 | 0.45 | 0.5 |
| 2016-11-08 | 0.05 | 0.29 | 0.45 | 0.49 |
| 2016-11-09 | 0.05 | 0.29 | 0.45 | 0.51 |
| 2016-11-10 | 0.05 | 0.29 | 0.45 | 0.55 |
| 2016-11-11 | 0.05 | 0.29 | 0.45 | 0.61 |
| 2016-11-14 | 0.05 | 0.29 | 0.45 | 0.66 |
| 2016-11-15 | 0.05 | 0.29 | 0.45 | 0.64 |
| 2016-11-16 | 0.05 | 0.29 | 0.45 | 0.65 |
| 2016-11-18 | 0.05 | 0.29 | 0.45 | 0.66 |
| 2016-11-21 | 0.05 | 0.29 | 0.45 | 0.63 |
| 2016-11-22 | 0.05 | 0.29 | 0.45 | 0.6 |
| 2016-11-23 | 0.05 | 0.29 | 0.45 | 0.56 |
| 2016-11-24 | 0.05 | 0.29 | 0.45 | 0.59 |
| 2016-11-25 | 0.05 | 0.29 | 0.45 | 0.59 |
| 2016-11-28 | 0.05 | 0.29 | 0.45 | 0.56 |
| 2016-11-29 | 0.05 | 0.29 | 0.45 | 0.56 |
| 2016-11-30 | 0.05 | 0.29 | 0.45 | 0.57 |
| 2016-12-01 | 0.05 | 0.29 | 0.45 | 0.64 |
| 2016-12-02 | 0.05 | 0.29 | 0.45 | 0.63 |
| 2016-12-05 | 0.05 | 0.29 | 0.45 | 0.62 |
| 2016-12-06 | 0.05 | 0.29 | 0.45 | 0.64 |
| 2016-12-07 | 0.05 | 0.29 | 0.45 | 0.66 |
| 2016-12-08 | 0.05 | 0.29 | 0.45 | 0.66 |
| 2016-12-09 | 0.05 | 0.29 | 0.45 | 0.64 |
| 2016-12-12 | 0.05 | 0.29 | 0.45 | 0.65 |
| 2016-12-13 | 0.05 | 0.29 | 0.45 | 0.63 |
| 2016-12-14 | 0.05 | 0.29 | 0.45 | 0.6 |
| 2016-12-15 | 0.05 | 0.29 | 0.45 | 0.64 |
| 2016-12-16 | 0.05 | 0.29 | 0.45 | 0.62 |
| 2016-12-19 | 0.05 | 0.29 | 0.44 | 0.59 |
| 2016-12-20 | 0.05 | 0.29 | 0.44 | 0.57 |
| 2016-12-21 | 0.05 | 0.29 | 0.44 | 0.56 |
| 2016-12-22 | 0.05 | 0.28 | 0.44 | 0.57 |
| 2016-12-23 | 0.05 | 0.28 | 0.44 | 0.55 |
| 2016-12-27 | 0.05 | 0.28 | 0.44 | 0.57 |
| 2016-12-28 | 0.05 | 0.27 | 0.43 | 0.54 |
| 2016-12-29 | 0.05 | 0.28 | 0.44 | 0.52 |
| 2016-12-30 | 0.05 | 0.28 | 0.44 | 0.52 |
| 2017-01-02 | 0.05 | 0.28 | 0.44 | 0.52 |
| 2017-01-03 | 0.05 | 0.28 | 0.44 | 0.52 |
| 2017-01-04 | 0.05 | 0.28 | 0.44 | 0.57 |
| 2017-01-05 | 0.05 | 0.28 | 0.44 | 0.59 |
| 2017-01-06 | 0.05 | 0.28 | 0.44 | 0.58 |
| 2017-01-09 | 0.05 | 0.28 | 0.44 | 0.61 |
| 2017-01-10 | 0.05 | 0.28 | 0.44 | 0.6 |
| 2017-01-11 | 0.05 | 0.28 | 0.44 | 0.59 |
| 2017-01-12 | 0.05 | 0.28 | 0.44 | 0.56 |
| 2017-01-13 | 0.05 | 0.28 | 0.44 | 0.52 |
| 2017-01-16 | 0.05 | 0.28 | 0.44 | 0.5 |
| 2017-01-17 | 0.05 | 0.28 | 0.44 | 0.48 |
| 2017-01-18 | 0.05 | 0.28 | 0.44 | 0.48 |
| 2017-01-19 | 0.05 | 0.28 | 0.44 | 0.5 |
| 2017-01-20 | 0.05 | 0.28 | 0.44 | 0.53 |
| 2017-01-23 | 0.05 | 0.28 | 0.44 | 0.56 |
| 2017-01-24 | 0.05 | 0.28 | 0.44 | 0.62 |
| 2017-01-25 | 0.05 | 0.28 | 0.44 | 0.7 |
| 2017-01-26 | 0.05 | 0.28 | 0.44 | 0.7 |
| 2017-01-27 | 0.05 | 0.28 | 0.44 | 0.74 |
| 2017-01-30 | 0.05 | 0.28 | 0.44 | 0.71 |
| 2017-01-31 | 0.05 | 0.28 | 0.44 | 0.71 |
| 2017-02-01 | 0.05 | 0.28 | 0.44 | 0.7 |
| 2017-02-02 | 0.05 | 0.28 | 0.44 | 0.72 |
| 2017-02-03 | 0.05 | 0.28 | 0.44 | 0.71 |
| 2017-02-06 | 0.05 | 0.28 | 0.44 | 0.71 |
| 2017-02-07 | 0.05 | 0.28 | 0.44 | 0.74 |
| 2017-02-08 | 0.05 | 0.28 | 0.44 | 0.75 |
| 2017-02-09 | 0.05 | 0.28 | 0.44 | 0.7 |
| 2017-02-10 | 0.05 | 0.28 | 0.44 | 0.72 |
| 2017-02-13 | 0.05 | 0.28 | 0.44 | 0.7 |
| 2017-02-14 | 0.05 | 0.28 | 0.44 | 0.77 |
| 2017-02-15 | 0.05 | 0.28 | 0.44 | 0.84 |
| 2017-02-16 | 0.05 | 0.28 | 0.44 | 0.83 |
| 2017-02-17 | 0.05 | 0.28 | 0.44 | 0.76 |
| 2017-02-20 | 0.05 | 0.28 | 0.44 | 0.79 |
| 2017-02-21 | 0.05 | 0.28 | 0.44 | 0.8 |
| 2017-02-22 | 0.05 | 0.28 | 0.44 | 0.78 |
| 2017-02-23 | 0.05 | 0.28 | 0.44 | 0.7 |
| 2017-02-24 | 0.05 | 0.28 | 0.44 | 0.68 |
| 2017-02-27 | 0.05 | 0.28 | 0.44 | 0.68 |
| 2017-02-28 | 0.05 | 0.28 | 0.44 | 0.77 |
| 2017-03-01 | 0.05 | 0.28 | 0.44 | 0.77 |
| 2017-03-02 | 0.05 | 0.28 | 0.44 | 0.85 |
| 2017-03-03 | 0.05 | 0.28 | 0.44 | 0.83 |
| 2017-03-06 | 0.05 | 0.28 | 0.44 | 0.86 |
| 2017-03-07 | 0.05 | 0.28 | 0.44 | 0.87 |
| 2017-03-08 | 0.05 | 0.28 | 0.44 | 0.96 |
| 2017-03-09 | 0.05 | 0.28 | 0.44 | 0.98 |
| 2017-03-10 | 0.05 | 0.28 | 0.44 | 0.99 |
| 2017-03-13 | 0.05 | 0.28 | 0.44 | 1 |
| 2017-03-14 | 0.05 | 0.28 | 0.44 | 1 |
| 2017-03-15 | 0.05 | 0.28 | 0.44 | 0.99 |
| 2017-03-16 | 0.05 | 0.28 | 0.44 | 0.99 |
| 2017-03-17 | 0.05 | 0.28 | 0.44 | 0.99 |
| 2017-03-20 | 0.05 | 0.28 | 0.44 | 0.96 |
| 2017-03-21 | 0.05 | 0.28 | 0.44 | 0.97 |
| 2017-03-22 | 0.05 | 0.28 | 0.44 | 0.9 |
| 2017-03-23 | 0.05 | 0.28 | 0.44 | 0.87 |
| 2017-03-24 | 0.05 | 0.28 | 0.44 | 0.92 |
| 2017-03-27 | 0.05 | 0.28 | 0.44 | 0.86 |
| 2017-03-28 | 0.05 | 0.28 | 0.44 | 0.84 |
| 2017-03-29 | 0.05 | 0.28 | 0.44 | 0.84 |
| 2017-03-30 | 0.05 | 0.28 | 0.44 | 0.8 |
| 2017-03-31 | 0.05 | 0.28 | 0.44 | 0.66 |
| 2017-04-03 | 0.05 | 0.28 | 0.44 | 0.71 |
| 2017-04-04 | 0.05 | 0.28 | 0.44 | 0.68 |
| 2017-04-05 | 0.05 | 0.28 | 0.44 | 0.73 |
| 2017-04-06 | 0.05 | 0.28 | 0.44 | 0.76 |
| 2017-04-07 | 0.05 | 0.29 | 0.44 | 0.89 |
| 2017-04-10 | 0.05 | 0.29 | 0.45 | 0.89 |
| 2017-04-11 | 0.05 | 0.29 | 0.45 | 0.91 |
| 2017-04-12 | 0.05 | 0.29 | 0.45 | 0.89 |
| 2017-04-13 | 0.05 | 0.29 | 0.45 | 0.88 |
| 2017-04-18 | 0.05 | 0.29 | 0.45 | 0.85 |
| 2017-04-19 | 0.05 | 0.29 | 0.45 | 0.82 |
| 2017-04-20 | 0.05 | 0.29 | 0.45 | 0.87 |
| 2017-04-21 | 0.05 | 0.29 | 0.45 | 0.88 |
| 2017-04-24 | 0.05 | 0.29 | 0.45 | 0.95 |
| 2017-04-25 | 0.05 | 0.29 | 0.45 | 0.93 |
| 2017-04-26 | 0.05 | 0.29 | 0.45 | 0.94 |
| 2017-04-27 | 0.05 | 0.29 | 0.45 | 0.99 |
| 2017-04-28 | 0.05 | 0.29 | 0.45 | 1.02 |
| 2017-05-02 | 0.05 | 0.29 | 0.45 | 1.02 |
| 2017-05-03 | 0.05 | 0.29 | 0.45 | 0.98 |
| 2017-05-04 | 0.05 | 0.29 | 0.45 | 1.01 |
| 2017-05-05 | 0.05 | 0.29 | 0.45 | 0.95 |
| 2017-05-09 | 0.05 | 0.29 | 0.46 | 0.97 |
| 2017-05-10 | 0.05 | 0.29 | 0.46 | 0.92 |
| 2017-05-11 | 0.05 | 0.3 | 0.46 | 0.94 |
| 2017-05-12 | 0.05 | 0.3 | 0.46 | 0.96 |
| 2017-05-15 | 0.05 | 0.3 | 0.46 | 0.96 |
| 2017-05-16 | 0.05 | 0.3 | 0.46 | 1 |
| 2017-05-17 | 0.05 | 0.3 | 0.46 | 0.97 |
| 2017-05-18 | 0.05 | 0.3 | 0.46 | 0.95 |
| 2017-05-19 | 0.05 | 0.3 | 0.46 | 0.96 |
| 2017-05-22 | 0.05 | 0.3 | 0.46 | 0.97 |
| 2017-05-23 | 0.05 | 0.3 | 0.46 | 0.94 |
| 2017-05-24 | 0.05 | 0.3 | 0.47 | 0.92 |
| 2017-05-25 | 0.05 | 0.3 | 0.47 | 0.89 |
| 2017-05-26 | 0.05 | 0.3 | 0.47 | 0.87 |
| 2017-05-29 | 0.05 | 0.3 | 0.47 | 0.87 |
| 2017-05-30 | 0.05 | 0.3 | 0.46 | 0.84 |
| 2017-05-31 | 0.05 | 0.3 | 0.46 | 0.82 |
| 2017-06-01 | 0.05 | 0.3 | 0.46 | 0.81 |
| 2017-06-02 | 0.05 | 0.29 | 0.46 | 0.81 |
| 2017-06-05 | 0.05 | 0.29 | 0.46 | 0.82 |
| 2017-06-06 | 0.05 | 0.29 | 0.46 | 0.82 |
| 2017-06-07 | 0.05 | 0.29 | 0.46 | 0.81 |
| 2017-06-08 | 0.05 | 0.29 | 0.46 | 0.85 |
| 2017-06-09 | 0.05 | 0.3 | 0.46 | 0.89 |
| 2017-06-12 | 0.05 | 0.3 | 0.46 | 0.86 |
| 2017-06-13 | 0.05 | 0.3 | 0.46 | 0.87 |
| 2017-06-14 | 0.05 | 0.3 | 0.46 | 0.87 |
| 2017-06-15 | 0.05 | 0.3 | 0.46 | 0.83 |
| 2017-06-16 | 0.05 | 0.3 | 0.46 | 0.88 |
| 2017-06-19 | 0.05 | 0.3 | 0.46 | 0.86 |
| 2017-06-20 | 0.05 | 0.3 | 0.46 | 0.86 |
| 2017-06-21 | 0.05 | 0.3 | 0.46 | 0.86 |
| 2017-06-22 | 0.05 | 0.3 | 0.46 | 0.86 |
| 2017-06-23 | 0.05 | 0.3 | 0.46 | 0.84 |
| 2017-06-26 | 0.05 | 0.3 | 0.46 | 0.83 |
| 2017-06-27 | 0.05 | 0.3 | 0.46 | 0.82 |
| 2017-06-28 | 0.05 | 0.3 | 0.46 | 0.89 |
| 2017-06-29 | 0.05 | 0.29 | 0.46 | 0.94 |
| 2017-06-30 | 0.05 | 0.3 | 0.46 | 0.97 |
| 2017-07-03 | 0.05 | 0.3 | 0.46 | 0.99 |
| 2017-07-04 | 0.05 | 0.3 | 0.46 | 0.98 |
| 2017-07-07 | 0.05 | 0.3 | 0.47 | 1.06 |
| 2017-07-10 | 0.05 | 0.3 | 0.47 | 1.08 |
| 2017-07-11 | 0.05 | 0.3 | 0.47 | 1.05 |
| 2017-07-12 | 0.05 | 0.3 | 0.47 | 1.05 |
| 2017-07-13 | 0.05 | 0.3 | 0.47 | 1.03 |
| 2017-07-14 | 0.05 | 0.3 | 0.47 | 1.03 |
| 2017-07-17 | 0.05 | 0.3 | 0.47 | 1.03 |
| 2017-07-18 | 0.05 | 0.3 | 0.47 | 1.03 |
| 2017-07-19 | 0.05 | 0.3 | 0.47 | 1.09 |
| 2017-07-20 | 0.05 | 0.3 | 0.48 | 1.1 |
| 2017-07-21 | 0.05 | 0.3 | 0.48 | 1.08 |
| 2017-07-24 | 0.05 | 0.3 | 0.48 | 1.08 |
| 2017-07-25 | 0.05 | 0.3 | 0.48 | 1.13 |
| 2017-07-26 | 0.05 | 0.3 | 0.48 | 1.14 |
| 2017-07-27 | 0.05 | 0.3 | 0.48 | 1.14 |
| 2017-07-28 | 0.05 | 0.31 | 0.48 | 1.15 |
| 2017-07-31 | 0.05 | 0.31 | 0.49 | 1.17 |
| 2017-08-01 | 0.05 | 0.31 | 0.49 | 1.18 |
| 2017-08-02 | 0.05 | 0.31 | 0.49 | 1.14 |
| 2017-08-03 | 0.05 | 0.31 | 0.49 | 1.16 |
| 2017-08-04 | 0.25 | 0.43 | 0.56 | 1.08 |
| 2017-08-07 | 0.25 | 0.44 | 0.59 | 1.07 |
| 2017-08-08 | 0.25 | 0.44 | 0.6 | 1.06 |
| 2017-08-09 | 0.25 | 0.45 | 0.6 | 1.09 |
| 2017-08-10 | 0.25 | 0.45 | 0.61 | 1.07 |
| 2017-08-11 | 0.25 | 0.45 | 0.61 | 1.09 |
| 2017-08-14 | 0.25 | 0.45 | 0.61 | 1.11 |
| 2017-08-15 | 0.25 | 0.45 | 0.61 | 1.11 |
| 2017-08-16 | 0.25 | 0.45 | 0.62 | 1.16 |
| 2017-08-17 | 0.25 | 0.46 | 0.62 | 1.14 |
| 2017-08-18 | 0.25 | 0.46 | 0.62 | 1.14 |
| 2017-08-21 | 0.25 | 0.46 | 0.62 | 1.14 |
| 2017-08-22 | 0.25 | 0.46 | 0.63 | 1.12 |
| 2017-08-23 | 0.25 | 0.46 | 0.63 | 1.13 |
| 2017-08-24 | 0.25 | 0.46 | 0.63 | 1.13 |
| 2017-08-25 | 0.25 | 0.46 | 0.63 | 1.14 |
| 2017-08-28 | 0.25 | 0.46 | 0.63 | 1.14 |
| 2017-08-29 | 0.25 | 0.46 | 0.63 | 1.14 |
| 2017-08-30 | 0.25 | 0.46 | 0.63 | 1.12 |
| 2017-08-31 | 0.25 | 0.46 | 0.63 | 1.14 |
| 2017-09-01 | 0.25 | 0.46 | 0.63 | 1.15 |
| 2017-09-04 | 0.25 | 0.46 | 0.63 | 1.19 |
| 2017-09-05 | 0.25 | 0.46 | 0.63 | 1.19 |
| 2017-09-06 | 0.25 | 0.46 | 0.63 | 1.17 |
| 2017-09-07 | 0.25 | 0.46 | 0.63 | 1.19 |
| 2017-09-08 | 0.25 | 0.46 | 0.63 | 1.2 |
| 2017-09-11 | 0.25 | 0.46 | 0.63 | 1.23 |
| 2017-09-12 | 0.25 | 0.46 | 0.64 | 1.24 |
| 2017-09-13 | 0.25 | 0.46 | 0.64 | 1.28 |
| 2017-09-14 | 0.25 | 0.46 | 0.64 | 1.28 |
| 2017-09-15 | 0.25 | 0.46 | 0.64 | 1.3 |
| 2017-09-18 | 0.25 | 0.46 | 0.64 | 1.3 |
| 2017-09-19 | 0.25 | 0.46 | 0.64 | 1.33 |
| 2017-09-20 | 0.25 | 0.46 | 0.64 | 1.32 |
| 2017-09-21 | 0.25 | 0.46 | 0.64 | 1.35 |
| 2017-09-22 | 0.25 | 0.46 | 0.64 | 1.32 |
| 2017-09-25 | 0.25 | 0.46 | 0.64 | 1.31 |
| 2017-09-26 | 0.25 | 0.46 | 0.64 | 1.3 |
| 2017-09-27 | 0.25 | 0.47 | 0.64 | 1.33 |
| 2017-09-29 | 0.25 | 0.47 | 0.65 | 1.37 |
| 2017-10-02 | 0.25 | 0.47 | 0.65 | 1.39 |
| 2017-10-03 | 0.25 | 0.47 | 0.65 | 1.39 |
| 2017-10-04 | 0.25 | 0.47 | 0.65 | 1.36 |
| 2017-10-05 | 0.25 | 0.48 | 0.66 | 1.32 |
| 2017-10-06 | 0.25 | 0.49 | 0.66 | 1.38 |
| 2017-10-09 | 0.25 | 0.49 | 0.67 | 1.36 |
| 2017-10-10 | 0.25 | 0.49 | 0.67 | 1.35 |
| 2017-10-11 | 0.25 | 0.49 | 0.66 | 1.37 |
| 2017-10-12 | 0.25 | 0.49 | 0.66 | 1.32 |
| 2017-10-13 | 0.25 | 0.5 | 0.67 | 1.35 |
| 2017-10-16 | 0.25 | 0.51 | 0.68 | 1.37 |
| 2017-10-17 | 0.25 | 0.51 | 0.69 | 1.4 |
| 2017-10-18 | 0.25 | 0.52 | 0.7 | 1.49 |
| 2017-10-19 | 0.25 | 0.52 | 0.71 | 1.45 |
| 2017-10-20 | 0.25 | 0.52 | 0.71 | 1.46 |
| 2017-10-23 | 0.25 | 0.53 | 0.72 | 1.47 |
| 2017-10-24 | 0.25 | 0.54 | 0.72 | 1.47 |
| 2017-10-25 | 0.25 | 0.54 | 0.73 | 1.53 |
| 2017-10-26 | 0.25 | 0.55 | 0.74 | 1.55 |
| 2017-10-27 | 0.25 | 0.56 | 0.74 | 1.56 |
| 2017-10-30 | 0.25 | 0.57 | 0.75 | 1.59 |
| 2017-10-31 | 0.25 | 0.58 | 0.77 | 1.52 |
| 2017-11-01 | 0.25 | 0.59 | 0.77 | 1.53 |
| 2017-11-02 | 0.25 | 0.61 | 0.79 | 1.59 |
| 2017-11-03 | 0.5 | 0.69 | 0.87 | 1.5 |
| 2017-11-06 | 0.5 | 0.7 | 0.89 | 1.48 |
| 2017-11-07 | 0.5 | 0.7 | 0.89 | 1.53 |
| 2017-11-08 | 0.5 | 0.71 | 0.89 | 1.52 |
| 2017-11-09 | 0.5 | 0.72 | 0.9 | 1.57 |
| 2017-11-10 | 0.5 | 0.72 | 0.91 | 1.61 |
| 2017-11-13 | 0.5 | 0.72 | 0.91 | 1.56 |
| 2017-11-14 | 0.5 | 0.72 | 0.92 | 1.59 |
| 2017-11-15 | 0.5 | 0.72 | 0.92 | 1.55 |
| 2017-11-16 | 0.5 | 0.72 | 0.93 | 1.63 |
| 2017-11-20 | 0.5 | 0.73 | 0.93 | 1.6 |
| 2017-11-21 | 0.5 | 0.73 | 0.94 | 1.65 |
| 2017-11-22 | 0.5 | 0.73 | 0.94 | 1.67 |
| 2017-11-23 | 0.5 | 0.73 | 0.94 | 1.68 |
| 2017-11-24 | 0.5 | 0.74 | 0.94 | 1.68 |
| 2017-11-27 | 0.5 | 0.74 | 0.94 | 1.68 |
| 2017-11-28 | 0.5 | 0.74 | 0.94 | 1.68 |
| 2017-11-29 | 0.5 | 0.74 | 0.95 | 1.65 |
| 2017-11-30 | 0.5 | 0.74 | 0.95 | 1.66 |
| 2017-12-01 | 0.5 | 0.74 | 0.94 | 1.6 |
| 2017-12-04 | 0.5 | 0.74 | 0.95 | 1.6 |
| 2017-12-05 | 0.5 | 0.74 | 0.95 | 1.59 |
| 2017-12-06 | 0.5 | 0.74 | 0.95 | 1.58 |
| 2017-12-07 | 0.5 | 0.74 | 0.95 | 1.57 |
| 2017-12-08 | 0.5 | 0.75 | 0.95 | 1.57 |
| 2017-12-11 | 0.5 | 0.75 | 0.95 | 1.59 |
| 2017-12-12 | 0.5 | 0.75 | 0.95 | 1.59 |
| 2017-12-13 | 0.5 | 0.75 | 0.96 | 1.64 |
| 2017-12-14 | 0.5 | 0.76 | 0.97 | 1.66 |
| 2017-12-15 | 0.5 | 0.76 | 0.97 | 1.66 |
| 2017-12-18 | 0.5 | 0.76 | 0.97 | 1.66 |
| 2017-12-19 | 0.5 | 0.76 | 0.97 | 1.65 |
| 2017-12-20 | 0.5 | 0.76 | 0.97 | 1.66 |
| 2017-12-21 | 0.5 | 0.76 | 0.97 | 1.66 |
| 2017-12-22 | 0.5 | 0.76 | 0.97 | 1.66 |
| 2017-12-27 | 0.5 | 0.76 | 0.97 | 1.63 |
| 2017-12-28 | 0.5 | 0.76 | 0.97 | 1.64 |
| 2017-12-29 | 0.5 | 0.76 | 0.97 | 1.64 |
| 2018-01-02 | 0.5 | 0.76 | 0.97 | 1.7 |
| 2018-01-03 | 0.5 | 0.76 | 0.97 | 1.69 |
| 2018-01-04 | 0.5 | 0.76 | 0.97 | 1.68 |
| 2018-01-05 | 0.5 | 0.76 | 0.97 | 1.65 |
| 2018-01-08 | 0.5 | 0.76 | 0.97 | 1.63 |
| 2018-01-09 | 0.5 | 0.76 | 0.97 | 1.63 |
| 2018-01-10 | 0.5 | 0.76 | 0.97 | 1.6 |
| 2018-01-11 | 0.5 | 0.78 | 0.99 | 1.59 |
| 2018-01-12 | 0.5 | 0.76 | 0.97 | 1.63 |
| 2018-01-15 | 0.5 | 0.76 | 0.97 | 1.65 |
| 2018-01-16 | 0.5 | 0.76 | 0.97 | 1.66 |
| 2018-01-17 | 0.5 | 0.77 | 0.98 | 1.69 |
| 2018-01-18 | 0.5 | 0.77 | 0.98 | 1.75 |
| 2018-01-19 | 0.5 | 0.77 | 0.98 | 1.77 |
| 2018-01-22 | 0.5 | 0.77 | 0.98 | 1.77 |
| 2018-01-23 | 0.5 | 0.77 | 0.98 | 1.75 |
| 2018-01-24 | 0.5 | 0.77 | 0.98 | 1.75 |
| 2018-01-25 | 0.5 | 0.78 | 0.99 | 1.75 |
| 2018-01-26 | 0.5 | 0.78 | 0.99 | 1.79 |
| 2018-01-29 | 0.5 | 0.79 | 1 | 1.86 |
| 2018-01-30 | 0.5 | 0.81 | 1.01 | 1.84 |
| 2018-01-31 | 0.5 | 0.81 | 1.02 | 1.82 |
| 2018-02-01 | 0.5 | 0.83 | 1.03 | 1.86 |
| 2018-02-02 | 0.75 | 0.91 | 1.11 | 1.9 |
| 2018-02-05 | 0.75 | 0.91 | 1.11 | 1.86 |
| 2018-02-06 | 0.75 | 0.91 | 1.11 | 1.8 |
| 2018-02-07 | 0.75 | 0.91 | 1.11 | 1.79 |
| 2018-02-08 | 0.75 | 0.91 | 1.11 | 1.81 |
| 2018-02-09 | 0.75 | 0.9 | 1.11 | 1.75 |
| 2018-02-12 | 0.75 | 0.9 | 1.11 | 1.77 |
| 2018-02-13 | 0.75 | 0.9 | 1.11 | 1.75 |
| 2018-02-14 | 0.75 | 0.9 | 1.11 | 1.72 |
| 2018-02-15 | 0.75 | 0.9 | 1.11 | 1.76 |
| 2018-02-16 | 0.75 | 0.9 | 1.11 | 1.73 |
| 2018-02-19 | 0.75 | 0.91 | 1.11 | 1.72 |
| 2018-02-20 | 0.75 | 0.91 | 1.11 | 1.76 |
| 2018-02-21 | 0.75 | 0.91 | 1.11 | 1.73 |
| 2018-02-22 | 0.75 | 0.91 | 1.12 | 1.71 |
| 2018-02-23 | 0.75 | 0.91 | 1.12 | 1.71 |
| 2018-02-26 | 0.75 | 0.91 | 1.12 | 1.69 |
| 2018-02-27 | 0.75 | 0.91 | 1.12 | 1.71 |
| 2018-02-28 | 0.75 | 0.91 | 1.12 | 1.73 |
| 2018-03-01 | 0.75 | 0.91 | 1.12 | 1.7 |
| 2018-03-02 | 0.75 | 0.91 | 1.12 | 1.68 |
| 2018-03-05 | 0.75 | 0.91 | 1.12 | 1.67 |
| 2018-03-06 | 0.75 | 0.91 | 1.12 | 1.69 |
| 2018-03-07 | 0.75 | 0.91 | 1.12 | 1.69 |
| 2018-03-08 | 0.75 | 0.91 | 1.12 | 1.71 |
| 2018-03-09 | 0.75 | 0.9 | 1.12 | 1.68 |
| 2018-03-12 | 0.75 | 0.9 | 1.12 | 1.67 |
| 2018-03-13 | 0.75 | 0.9 | 1.12 | 1.67 |
| 2018-03-14 | 0.75 | 0.9 | 1.12 | 1.67 |
| 2018-03-15 | 0.75 | 0.9 | 1.12 | 1.7 |
| 2018-03-16 | 0.75 | 0.9 | 1.12 | 1.7 |
| 2018-03-19 | 0.75 | 0.9 | 1.12 | 1.71 |
| 2018-03-20 | 0.75 | 0.9 | 1.12 | 1.72 |
| 2018-03-21 | 0.75 | 0.9 | 1.12 | 1.76 |
| 2018-03-22 | 0.75 | 0.9 | 1.12 | 1.75 |
| 2018-03-23 | 0.75 | 0.9 | 1.12 | 1.73 |
| 2018-03-26 | 0.75 | 0.9 | 1.12 | 1.71 |
| 2018-03-27 | 0.75 | 0.9 | 1.12 | 1.69 |
| 2018-03-28 | 0.75 | 0.9 | 1.12 | 1.64 |
| 2018-03-29 | 0.75 | 0.9 | 1.12 | 1.65 |
| 2018-04-03 | 0.75 | 0.9 | 1.12 | 1.66 |
| 2018-04-04 | 0.75 | 0.9 | 1.12 | 1.66 |
| 2018-04-05 | 0.75 | 0.9 | 1.12 | 1.68 |
| 2018-04-06 | 0.75 | 0.9 | 1.12 | 1.66 |
| 2018-04-09 | 0.75 | 0.9 | 1.12 | 1.65 |
| 2018-04-10 | 0.75 | 0.9 | 1.12 | 1.65 |
| 2018-04-11 | 0.75 | 0.9 | 1.12 | 1.63 |
| 2018-04-12 | 0.75 | 0.9 | 1.12 | 1.62 |
| 2018-04-13 | 0.75 | 0.9 | 1.12 | 1.64 |
| 2018-04-16 | 0.75 | 0.9 | 1.12 | 1.64 |
| 2018-04-17 | 0.75 | 0.9 | 1.13 | 1.63 |
| 2018-04-18 | 0.75 | 0.9 | 1.12 | 1.61 |
| 2018-04-19 | 0.75 | 0.9 | 1.12 | 1.62 |
| 2018-04-20 | 0.75 | 0.9 | 1.12 | 1.63 |
| 2018-04-23 | 0.75 | 0.9 | 1.12 | 1.66 |
| 2018-04-24 | 0.75 | 0.9 | 1.12 | 1.65 |
| 2018-04-25 | 0.75 | 0.9 | 1.12 | 1.66 |
| 2018-04-26 | 0.75 | 0.9 | 1.12 | 1.66 |
| 2018-04-27 | 0.75 | 0.9 | 1.12 | 1.62 |
| 2018-04-30 | 0.75 | 0.9 | 1.12 | 1.62 |
| 2018-05-02 | 0.75 | 0.9 | 1.12 | 1.64 |
| 2018-05-03 | 0.75 | 0.9 | 1.12 | 1.67 |
| 2018-05-04 | 0.75 | 0.9 | 1.12 | 1.68 |
| 2018-05-07 | 0.75 | 0.9 | 1.12 | 1.68 |
| 2018-05-09 | 0.75 | 0.9 | 1.12 | 1.74 |
| 2018-05-10 | 0.75 | 0.9 | 1.12 | 1.76 |
| 2018-05-11 | 0.75 | 0.9 | 1.12 | 1.76 |
| 2018-05-14 | 0.75 | 0.9 | 1.12 | 1.8 |
| 2018-05-15 | 0.75 | 0.9 | 1.12 | 1.82 |
| 2018-05-16 | 0.75 | 0.9 | 1.12 | 1.84 |
| 2018-05-17 | 0.75 | 0.9 | 1.12 | 1.86 |
| 2018-05-18 | 0.75 | 0.9 | 1.12 | 1.84 |
| 2018-05-21 | 0.75 | 0.9 | 1.12 | 1.87 |
| 2018-05-22 | 0.75 | 0.9 | 1.12 | 1.89 |
| 2018-05-23 | 0.75 | 0.9 | 1.12 | 1.85 |
| 2018-05-24 | 0.75 | 0.9 | 1.12 | 1.82 |
| 2018-05-25 | 0.75 | 0.9 | 1.12 | 1.79 |
| 2018-05-28 | 0.75 | 0.9 | 1.12 | 1.76 |
| 2018-05-29 | 0.75 | 0.9 | 1.12 | 1.7 |
| 2018-05-30 | 0.75 | 0.9 | 1.12 | 1.68 |
| 2018-05-31 | 0.75 | 0.9 | 1.12 | 1.73 |
| 2018-06-01 | 0.75 | 0.9 | 1.12 | 1.72 |
| 2018-06-04 | 0.75 | 0.9 | 1.12 | 1.73 |
| 2018-06-05 | 0.75 | 0.9 | 1.12 | 1.76 |
| 2018-06-06 | 0.75 | 0.9 | 1.12 | 1.83 |
| 2018-06-07 | 0.75 | 0.9 | 1.12 | 1.86 |
| 2018-06-08 | 0.75 | 0.9 | 1.12 | 1.84 |
| 2018-06-11 | 0.75 | 0.92 | 1.13 | 1.93 |
| 2018-06-12 | 0.75 | 0.92 | 1.14 | 1.93 |
| 2018-06-13 | 0.75 | 0.92 | 1.14 | 1.91 |
| 2018-06-14 | 0.75 | 0.93 | 1.14 | 1.94 |
| 2018-06-15 | 0.75 | 0.92 | 1.14 | 1.94 |
| 2018-06-18 | 0.75 | 0.93 | 1.15 | 1.91 |
| 2018-06-19 | 0.75 | 0.93 | 1.15 | 1.87 |
| 2018-06-20 | 0.75 | 0.93 | 1.15 | 1.85 |
| 2018-06-21 | 0.75 | 0.93 | 1.15 | 1.85 |
| 2018-06-22 | 0.75 | 0.93 | 1.16 | 1.85 |
| 2018-06-25 | 0.75 | 0.93 | 1.16 | 1.8 |
| 2018-06-26 | 0.75 | 0.93 | 1.16 | 1.84 |
| 2018-06-27 | 0.75 | 0.93 | 1.16 | 1.82 |
| 2018-06-28 | 1 | 1.16 | 1.35 | 1.94 |
| 2018-06-29 | 1 | 1.16 | 1.35 | 1.94 |
| 2018-07-02 | 1 | 1.16 | 1.35 | 1.92 |
| 2018-07-03 | 1 | 1.16 | 1.35 | 1.97 |
| 2018-07-04 | 1 | 1.17 | 1.36 | 2 |
| 2018-07-09 | 1 | 1.17 | 1.37 | 1.92 |
| 2018-07-10 | 1 | 1.17 | 1.37 | 1.94 |
| 2018-07-11 | 1 | 1.18 | 1.38 | 2.02 |
| 2018-07-12 | 1 | 1.18 | 1.38 | 2.02 |
| 2018-07-13 | 1 | 1.18 | 1.39 | 2.05 |
| 2018-07-16 | 1 | 1.18 | 1.39 | 2.03 |
| 2018-07-17 | 1 | 1.19 | 1.4 | 2.03 |
| 2018-07-18 | 1 | 1.18 | 1.39 | 2.01 |
| 2018-07-19 | 1 | 1.19 | 1.39 | 2.02 |
| 2018-07-20 | 1 | 1.18 | 1.39 | 2.01 |
| 2018-07-23 | 1 | 1.19 | 1.39 | 2.03 |
| 2018-07-24 | 1 | 1.19 | 1.4 | 2.08 |
| 2018-07-25 | 1 | 1.2 | 1.41 | 2.09 |
| 2018-07-26 | 1 | 1.2 | 1.41 | 2.12 |
| 2018-07-27 | 1 | 1.2 | 1.41 | 2.15 |
| 2018-07-30 | 1 | 1.21 | 1.43 | 2.15 |
| 2018-07-31 | 1 | 1.22 | 1.43 | 2.17 |
| 2018-08-01 | 1 | 1.23 | 1.45 | 2.18 |
| 2018-08-02 | 1 | 1.24 | 1.45 | 2.17 |
| 2018-08-03 | 1.25 | 1.42 | 1.61 | 2.21 |
| 2018-08-06 | 1.25 | 1.44 | 1.64 | 2.19 |
| 2018-08-07 | 1.25 | 1.45 | 1.65 | 2.19 |
| 2018-08-08 | 1.25 | 1.45 | 1.66 | 2.19 |
| 2018-08-09 | 1.25 | 1.46 | 1.67 | 2.17 |
| 2018-08-10 | 1.25 | 1.46 | 1.67 | 2.18 |
| 2018-08-13 | 1.25 | 1.46 | 1.68 | 2.15 |
| 2018-08-14 | 1.25 | 1.46 | 1.68 | 2.13 |
| 2018-08-15 | 1.25 | 1.46 | 1.68 | 2.16 |
| 2018-08-16 | 1.25 | 1.46 | 1.68 | 2.17 |
| 2018-08-17 | 1.25 | 1.47 | 1.68 | 2.18 |
| 2018-08-20 | 1.25 | 1.47 | 1.69 | 2.2 |
| 2018-08-21 | 1.25 | 1.48 | 1.7 | 2.22 |
| 2018-08-22 | 1.25 | 1.48 | 1.71 | 2.22 |
| 2018-08-23 | 1.25 | 1.48 | 1.71 | 2.23 |
| 2018-08-24 | 1.25 | 1.48 | 1.71 | 2.24 |
| 2018-08-27 | 1.25 | 1.49 | 1.71 | 2.24 |
| 2018-08-28 | 1.25 | 1.49 | 1.72 | 2.24 |
| 2018-08-29 | 1.25 | 1.49 | 1.72 | 2.24 |
| 2018-08-30 | 1.25 | 1.49 | 1.73 | 2.24 |
| 2018-08-31 | 1.25 | 1.5 | 1.73 | 2.23 |
| 2018-09-03 | 1.25 | 1.5 | 1.73 | 2.23 |
| 2018-09-04 | 1.25 | 1.5 | 1.74 | 2.25 |
| 2018-09-05 | 1.25 | 1.51 | 1.74 | 2.29 |
| 2018-09-06 | 1.25 | 1.51 | 1.75 | 2.3 |
| 2018-09-07 | 1.25 | 1.51 | 1.74 | 2.3 |
| 2018-09-10 | 1.25 | 1.51 | 1.75 | 2.3 |
| 2018-09-11 | 1.25 | 1.52 | 1.77 | 2.37 |
| 2018-09-12 | 1.25 | 1.53 | 1.78 | 2.4 |
| 2018-09-13 | 1.25 | 1.54 | 1.78 | 2.39 |
| 2018-09-14 | 1.25 | 1.54 | 1.79 | 2.39 |
| 2018-09-17 | 1.25 | 1.54 | 1.79 | 2.39 |
| 2018-09-18 | 1.25 | 1.55 | 1.8 | 2.39 |
| 2018-09-19 | 1.25 | 1.56 | 1.81 | 2.42 |
| 2018-09-20 | 1.25 | 1.56 | 1.81 | 2.44 |
| 2018-09-21 | 1.25 | 1.56 | 1.82 | 2.43 |
| 2018-09-24 | 1.25 | 1.56 | 1.82 | 2.43 |
| 2018-09-25 | 1.25 | 1.57 | 1.82 | 2.46 |
| 2018-09-26 | 1.25 | 1.58 | 1.83 | 2.46 |
| 2018-09-27 | 1.5 | 1.7 | 1.89 | 2.43 |
| 2018-10-01 | 1.5 | 1.72 | 1.9 | 2.43 |
| 2018-10-02 | 1.5 | 1.73 | 1.91 | 2.43 |
| 2018-10-03 | 1.5 | 1.73 | 1.92 | 2.5 |
| 2018-10-04 | 1.5 | 1.74 | 1.93 | 2.57 |
| 2018-10-05 | 1.5 | 1.74 | 1.93 | 2.56 |
| 2018-10-08 | 1.5 | 1.74 | 1.93 | 2.56 |
| 2018-10-09 | 1.5 | 1.75 | 1.93 | 2.6 |
| 2018-10-10 | 1.5 | 1.75 | 1.94 | 2.61 |
| 2018-10-11 | 1.5 | 1.75 | 1.95 | 2.61 |
| 2018-10-12 | 1.5 | 1.75 | 1.96 | 2.63 |
| 2018-10-15 | 1.5 | 1.76 | 1.96 | 2.64 |
| 2018-10-16 | 1.5 | 1.76 | 1.97 | 2.66 |
| 2018-10-17 | 1.5 | 1.76 | 1.97 | 2.65 |
| 2018-10-18 | 1.5 | 1.76 | 1.97 | 2.66 |
| 2018-10-19 | 1.5 | 1.77 | 1.97 | 2.64 |
| 2018-10-22 | 1.5 | 1.77 | 1.97 | 2.67 |
| 2018-10-23 | 1.5 | 1.77 | 1.98 | 2.64 |
| 2018-10-24 | 1.5 | 1.78 | 1.98 | 2.57 |
| 2018-10-25 | 1.5 | 1.78 | 1.97 | 2.56 |
| 2018-10-26 | 1.5 | 1.79 | 1.98 | 2.56 |
| 2018-10-29 | 1.5 | 1.8 | 1.99 | 2.55 |
| 2018-10-30 | 1.5 | 1.8 | 1.99 | 2.56 |
| 2018-10-31 | 1.5 | 1.81 | 2 | 2.58 |
| 2018-11-01 | 1.5 | 1.82 | 2.01 | 2.6 |
| 2018-11-02 | 1.75 | 1.96 | 2.14 | 2.58 |
| 2018-11-05 | 1.75 | 1.97 | 2.14 | 2.57 |
| 2018-11-06 | 1.75 | 1.97 | 2.15 | 2.52 |
| 2018-11-07 | 1.75 | 1.97 | 2.16 | 2.56 |
| 2018-11-08 | 1.75 | 1.98 | 2.17 | 2.6 |
| 2018-11-09 | 1.75 | 1.99 | 2.18 | 2.6 |
| 2018-11-12 | 1.75 | 1.99 | 2.18 | 2.6 |
| 2018-11-13 | 1.75 | 1.99 | 2.18 | 2.62 |
| 2018-11-14 | 1.75 | 1.99 | 2.19 | 2.58 |
| 2018-11-15 | 1.75 | 2 | 2.2 | 2.56 |
| 2018-11-16 | 1.75 | 2 | 2.2 | 2.56 |
| 2018-11-19 | 1.75 | 2 | 2.2 | 2.55 |
| 2018-11-20 | 1.75 | 2.01 | 2.21 | 2.53 |
| 2018-11-21 | 1.75 | 2.01 | 2.21 | 2.51 |
| 2018-11-22 | 1.75 | 2.01 | 2.21 | 2.48 |
| 2018-11-23 | 1.75 | 2.02 | 2.22 | 2.49 |
| 2018-11-26 | 1.75 | 2.02 | 2.22 | 2.46 |
| 2018-11-27 | 1.75 | 2.02 | 2.22 | 2.4 |
| 2018-11-28 | 1.75 | 2.02 | 2.22 | 2.4 |
| 2018-11-29 | 1.75 | 2.02 | 2.22 | 2.42 |
| 2018-11-30 | 1.75 | 2.02 | 2.22 | 2.41 |
| 2018-12-03 | 1.75 | 2.01 | 2.21 | 2.47 |
| 2018-12-04 | 1.75 | 2.01 | 2.21 | 2.4 |
| 2018-12-05 | 1.75 | 2.01 | 2.21 | 2.37 |
| 2018-12-06 | 1.75 | 2.01 | 2.21 | 2.37 |
| 2018-12-07 | 1.75 | 2.01 | 2.21 | 2.36 |
| 2018-12-10 | 1.75 | 2.01 | 2.21 | 2.34 |
| 2018-12-11 | 1.75 | 2.01 | 2.21 | 2.32 |
| 2018-12-12 | 1.75 | 2.01 | 2.21 | 2.34 |
| 2018-12-13 | 1.75 | 2.02 | 2.21 | 2.36 |
| 2018-12-14 | 1.75 | 2.02 | 2.21 | 2.35 |
| 2018-12-17 | 1.75 | 2.02 | 2.21 | 2.33 |
| 2018-12-18 | 1.75 | 2.02 | 2.21 | 2.3 |
| 2018-12-19 | 1.75 | 2.02 | 2.21 | 2.29 |
| 2018-12-20 | 1.75 | 2.02 | 2.21 | 2.11 |
| 2018-12-21 | 1.75 | 2.02 | 2.21 | 2.06 |
| 2018-12-27 | 1.75 | 2.01 | 2.2 | 1.99 |
| 2018-12-28 | 1.75 | 2.02 | 2.21 | 1.86 |
| 2018-12-31 | 1.75 | 2.01 | 2.21 | 1.85 |
| 2019-01-02 | 1.75 | 2.01 | 2.2 | 1.75 |
| 2019-01-03 | 1.75 | 2.01 | 2.2 | 1.74 |
| 2019-01-04 | 1.75 | 2.01 | 2.21 | 1.83 |
| 2019-01-07 | 1.75 | 2.01 | 2.21 | 1.88 |
| 2019-01-08 | 1.75 | 2.01 | 2.21 | 1.9 |
| 2019-01-09 | 1.75 | 2.01 | 2.21 | 2 |
| 2019-01-10 | 1.75 | 2.01 | 2.21 | 1.97 |
| 2019-01-11 | 1.75 | 2.01 | 2.21 | 1.94 |
| 2019-01-14 | 1.75 | 2.01 | 2.21 | 1.88 |
| 2019-01-15 | 1.75 | 2.01 | 2.21 | 1.77 |
| 2019-01-16 | 1.75 | 2.01 | 2.21 | 1.88 |
| 2019-01-17 | 1.75 | 2.01 | 2.21 | 1.94 |
| 2019-01-18 | 1.75 | 2.01 | 2.22 | 2.01 |
| 2019-01-21 | 1.75 | 2.01 | 2.22 | 1.99 |
| 2019-01-22 | 1.75 | 2.01 | 2.22 | 1.99 |
| 2019-01-23 | 1.75 | 2.01 | 2.22 | 1.96 |
| 2019-01-24 | 1.75 | 2 | 2.22 | 1.97 |
| 2019-01-25 | 1.75 | 2 | 2.22 | 1.93 |
| 2019-01-28 | 1.75 | 2 | 2.22 | 1.93 |
| 2019-01-29 | 1.75 | 1.99 | 2.22 | 1.96 |
| 2019-01-30 | 1.75 | 1.99 | 2.21 | 1.93 |
| 2019-01-31 | 1.75 | 1.99 | 2.21 | 1.86 |
| 2019-02-01 | 1.75 | 1.99 | 2.21 | 1.86 |
| 2019-02-04 | 1.75 | 1.99 | 2.2 | 1.84 |
| 2019-02-05 | 1.75 | 1.99 | 2.2 | 1.83 |
| 2019-02-06 | 1.75 | 1.99 | 2.2 | 1.82 |
| 2019-02-07 | 1.75 | 1.99 | 2.2 | 1.79 |
| 2019-02-08 | 1.75 | 1.99 | 2.2 | 1.78 |
| 2019-02-11 | 1.75 | 1.99 | 2.2 | 1.76 |
| 2019-02-12 | 1.75 | 1.99 | 2.2 | 1.78 |
| 2019-02-13 | 1.75 | 2 | 2.19 | 1.83 |
| 2019-02-14 | 1.75 | 2 | 2.19 | 1.9 |
| 2019-02-15 | 1.75 | 2.01 | 2.19 | 1.93 |
| 2019-02-18 | 1.75 | 2.02 | 2.19 | 1.97 |
| 2019-02-19 | 1.75 | 2.02 | 2.19 | 1.98 |
| 2019-02-20 | 1.75 | 2.02 | 2.19 | 1.92 |
| 2019-02-21 | 1.75 | 2.02 | 2.19 | 1.95 |
| 2019-02-22 | 1.75 | 2.02 | 2.19 | 1.98 |
| 2019-02-25 | 1.75 | 2.02 | 2.2 | 1.99 |
| 2019-02-26 | 1.75 | 2.02 | 2.2 | 2 |
| 2019-02-27 | 1.75 | 2.02 | 2.2 | 2.02 |
| 2019-02-28 | 1.75 | 2.02 | 2.2 | 2.06 |
| 2019-03-01 | 1.75 | 2.03 | 2.2 | 2.07 |
| 2019-03-04 | 1.75 | 2.03 | 2.2 | 2.1 |
| 2019-03-05 | 1.75 | 2.03 | 2.2 | 2.1 |
| 2019-03-06 | 1.75 | 2.03 | 2.2 | 2.07 |
| 2019-03-07 | 1.75 | 2.03 | 2.21 | 2.06 |
| 2019-03-08 | 1.75 | 2.03 | 2.2 | 1.99 |
| 2019-03-11 | 1.75 | 2.03 | 2.2 | 1.99 |
| 2019-03-12 | 1.75 | 2.03 | 2.2 | 1.99 |
| 2019-03-13 | 1.75 | 2.03 | 2.2 | 1.96 |
| 2019-03-14 | 1.75 | 2.03 | 2.2 | 1.98 |
| 2019-03-15 | 1.75 | 2.03 | 2.2 | 2.02 |
| 2019-03-18 | 1.75 | 2.03 | 2.2 | 2.04 |
| 2019-03-19 | 1.75 | 2.03 | 2.2 | 2.05 |
| 2019-03-20 | 1.75 | 2.03 | 2.2 | 2.06 |
| 2019-03-21 | 1.75 | 2.03 | 2.2 | 1.98 |
| 2019-03-22 | 1.75 | 2.03 | 2.2 | 1.93 |
| 2019-03-25 | 1.75 | 2.02 | 2.2 | 1.87 |
| 2019-03-26 | 1.75 | 2.02 | 2.2 | 1.87 |
| 2019-03-27 | 1.75 | 2.02 | 2.2 | 1.86 |
| 2019-03-28 | 1.75 | 2.02 | 2.2 | 1.8 |
| 2019-03-29 | 1.75 | 2.02 | 2.2 | 1.83 |
| 2019-04-01 | 1.75 | 2.02 | 2.2 | 1.84 |
| 2019-04-02 | 1.75 | 2.02 | 2.2 | 1.87 |
| 2019-04-03 | 1.75 | 2.02 | 2.2 | 1.93 |
| 2019-04-04 | 1.75 | 2.02 | 2.2 | 1.94 |
| 2019-04-05 | 1.75 | 2.02 | 2.2 | 1.99 |
| 2019-04-08 | 1.75 | 2.02 | 2.2 | 1.98 |
| 2019-04-09 | 1.75 | 2.02 | 2.2 | 1.97 |
| 2019-04-10 | 1.75 | 2.02 | 2.2 | 1.97 |
| 2019-04-11 | 1.75 | 2.02 | 2.2 | 1.93 |
| 2019-04-12 | 1.75 | 2.02 | 2.21 | 1.95 |
| 2019-04-15 | 1.75 | 2.02 | 2.21 | 1.97 |
| 2019-04-16 | 1.75 | 2.02 | 2.21 | 1.96 |
| 2019-04-17 | 1.75 | 2.02 | 2.21 | 1.98 |
| 2019-04-18 | 1.75 | 2.02 | 2.21 | 1.98 |
| 2019-04-23 | 1.75 | 2.02 | 2.22 | 1.96 |
| 2019-04-24 | 1.75 | 2.02 | 2.22 | 1.99 |
| 2019-04-25 | 1.75 | 2.02 | 2.22 | 2 |
| 2019-04-26 | 1.75 | 2.03 | 2.23 | 2.06 |
| 2019-04-29 | 1.75 | 2.04 | 2.23 | 2.06 |
| 2019-04-30 | 1.75 | 2.05 | 2.23 | 2.13 |
| 2019-05-02 | 1.75 | 2.05 | 2.23 | 2.13 |
| 2019-05-03 | 2 | 2.2 | 2.34 | 2.12 |
| 2019-05-06 | 2 | 2.21 | 2.34 | 2.09 |
| 2019-05-07 | 2 | 2.21 | 2.34 | 2.08 |
| 2019-05-09 | 2 | 2.21 | 2.34 | 2.06 |
| 2019-05-10 | 2 | 2.2 | 2.34 | 2.08 |
| 2019-05-13 | 2 | 2.2 | 2.33 | 2.05 |
| 2019-05-14 | 2 | 2.2 | 2.33 | 2.02 |
| 2019-05-15 | 2 | 2.2 | 2.32 | 1.95 |
| 2019-05-16 | 2 | 2.2 | 2.32 | 1.95 |
| 2019-05-17 | 2 | 2.2 | 2.32 | 1.96 |
| 2019-05-20 | 2 | 2.2 | 2.32 | 1.97 |
| 2019-05-21 | 2 | 2.2 | 2.32 | 1.96 |
| 2019-05-22 | 2 | 2.2 | 2.32 | 1.92 |
| 2019-05-23 | 2 | 2.19 | 2.31 | 1.88 |
| 2019-05-24 | 2 | 2.19 | 2.31 | 1.88 |
| 2019-05-27 | 2 | 2.19 | 2.31 | 1.9 |
| 2019-05-28 | 2 | 2.19 | 2.31 | 1.88 |
| 2019-05-29 | 2 | 2.19 | 2.31 | 1.87 |
| 2019-05-30 | 2 | 2.19 | 2.31 | 1.86 |
| 2019-05-31 | 2 | 2.19 | 2.31 | 1.79 |
| 2019-06-03 | 2 | 2.19 | 2.31 | 1.77 |
| 2019-06-04 | 2 | 2.18 | 2.3 | 1.78 |
| 2019-06-05 | 2 | 2.18 | 2.3 | 1.82 |
| 2019-06-06 | 2 | 2.18 | 2.3 | 1.79 |
| 2019-06-07 | 2 | 2.18 | 2.3 | 1.8 |
| 2019-06-10 | 2 | 2.17 | 2.29 | 1.79 |
| 2019-06-11 | 2 | 2.17 | 2.29 | 1.81 |
| 2019-06-12 | 2 | 2.17 | 2.29 | 1.77 |
| 2019-06-13 | 2 | 2.17 | 2.29 | 1.73 |
| 2019-06-14 | 2 | 2.17 | 2.29 | 1.68 |
| 2019-06-17 | 2 | 2.17 | 2.29 | 1.7 |
| 2019-06-18 | 2 | 2.17 | 2.29 | 1.66 |
| 2019-06-19 | 2 | 2.17 | 2.29 | 1.66 |
| 2019-06-20 | 2 | 2.17 | 2.29 | 1.65 |
| 2019-06-21 | 2 | 2.17 | 2.29 | 1.67 |
| 2019-06-24 | 2 | 2.17 | 2.29 | 1.68 |
| 2019-06-25 | 2 | 2.17 | 2.29 | 1.68 |
| 2019-06-26 | 2 | 2.17 | 2.29 | 1.69 |
| 2019-06-27 | 2 | 2.17 | 2.29 | 1.72 |
| 2019-06-28 | 2 | 2.17 | 2.29 | 1.69 |
| 2019-07-01 | 2 | 2.17 | 2.29 | 1.68 |
| 2019-07-02 | 2 | 2.17 | 2.29 | 1.67 |
| 2019-07-03 | 2 | 2.17 | 2.29 | 1.59 |
| 2019-07-04 | 2 | 2.17 | 2.29 | 1.59 |
| 2019-07-08 | 2 | 2.17 | 2.29 | 1.63 |
| 2019-07-09 | 2 | 2.17 | 2.28 | 1.6 |
| 2019-07-10 | 2 | 2.17 | 2.28 | 1.63 |
| 2019-07-11 | 2 | 2.17 | 2.28 | 1.62 |
| 2019-07-12 | 2 | 2.17 | 2.28 | 1.72 |
| 2019-07-15 | 2 | 2.16 | 2.28 | 1.7 |
| 2019-07-16 | 2 | 2.16 | 2.28 | 1.7 |
| 2019-07-17 | 2 | 2.16 | 2.28 | 1.7 |
| 2019-07-18 | 2 | 2.16 | 2.28 | 1.7 |
| 2019-07-19 | 2 | 2.16 | 2.28 | 1.7 |